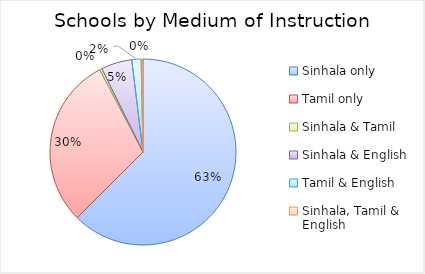
| Category | Series 0 |
|---|---|
| Sinhala only | 6372 |
| Tamil only | 3037 |
| Sinhala & Tamil | 40 |
| Sinhala & English | 547 |
| Tamil & English | 165 |
| Sinhala, Tamil & English | 33 |